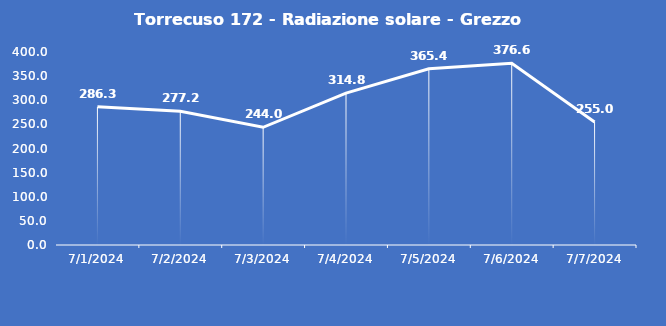
| Category | Torrecuso 172 - Radiazione solare - Grezzo (W/m2) |
|---|---|
| 7/1/24 | 286.3 |
| 7/2/24 | 277.2 |
| 7/3/24 | 244 |
| 7/4/24 | 314.8 |
| 7/5/24 | 365.4 |
| 7/6/24 | 376.6 |
| 7/7/24 | 255 |